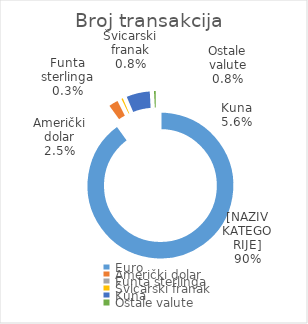
| Category | Broj transakcija  |
|---|---|
| Euro | 6117513 |
| Američki dolar | 168743 |
| Funta sterlinga | 18374 |
| Švicarski franak | 51019 |
| Kuna | 381741 |
| Ostale valute | 55419 |